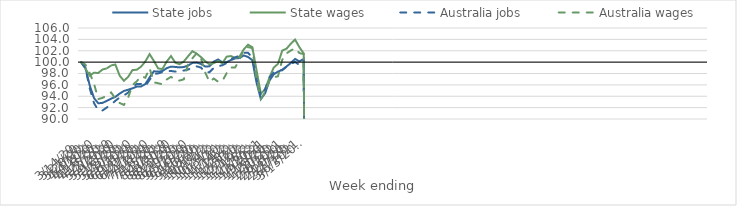
| Category | State jobs | State wages | Australia jobs | Australia wages |
|---|---|---|---|---|
| 14/03/2020 | 100 | 100 | 100 | 100 |
| 21/03/2020 | 99.025 | 98.86 | 98.956 | 99.571 |
| 28/03/2020 | 95.919 | 97.625 | 95.411 | 98.095 |
| 04/04/2020 | 93.692 | 98.134 | 92.814 | 96.217 |
| 11/04/2020 | 92.763 | 98.092 | 91.522 | 93.51 |
| 18/04/2020 | 92.832 | 98.711 | 91.499 | 93.706 |
| 25/04/2020 | 93.193 | 98.894 | 92.024 | 94.115 |
| 02/05/2020 | 93.578 | 99.418 | 92.518 | 94.669 |
| 09/05/2020 | 93.887 | 99.583 | 93.198 | 93.587 |
| 16/05/2020 | 94.47 | 97.623 | 93.789 | 92.821 |
| 23/05/2020 | 94.932 | 96.717 | 94.145 | 92.476 |
| 30/05/2020 | 95.151 | 97.42 | 94.654 | 93.783 |
| 06/06/2020 | 95.396 | 98.605 | 95.642 | 95.969 |
| 13/06/2020 | 95.694 | 98.662 | 96.146 | 96.63 |
| 20/06/2020 | 95.718 | 99.201 | 96.166 | 97.54 |
| 27/06/2020 | 96.144 | 100.112 | 95.757 | 97.254 |
| 04/07/2020 | 97.306 | 101.406 | 96.891 | 98.931 |
| 11/07/2020 | 98.39 | 100.205 | 97.918 | 96.452 |
| 18/07/2020 | 98.326 | 98.885 | 98.015 | 96.287 |
| 25/07/2020 | 98.437 | 98.79 | 98.234 | 96.104 |
| 01/08/2020 | 98.94 | 100.108 | 98.45 | 96.943 |
| 08/08/2020 | 99.208 | 101.063 | 98.442 | 97.412 |
| 15/08/2020 | 99.155 | 99.901 | 98.335 | 96.914 |
| 22/08/2020 | 99.075 | 99.636 | 98.39 | 96.757 |
| 29/08/2020 | 99.139 | 100.112 | 98.521 | 96.978 |
| 05/09/2020 | 99.399 | 101.038 | 98.687 | 99.677 |
| 12/09/2020 | 99.861 | 101.919 | 99.091 | 100.68 |
| 19/09/2020 | 99.918 | 101.497 | 99.254 | 101.536 |
| 26/09/2020 | 99.669 | 100.883 | 99.049 | 100.689 |
| 03/10/2020 | 99.23 | 100.154 | 98.196 | 98.175 |
| 10/10/2020 | 99.261 | 99.603 | 98.237 | 96.534 |
| 17/10/2020 | 100.087 | 99.826 | 98.99 | 97.113 |
| 24/10/2020 | 100.46 | 100.181 | 99.254 | 96.552 |
| 31/10/2020 | 99.97 | 99.81 | 99.461 | 96.668 |
| 07/11/2020 | 99.993 | 100.958 | 99.844 | 98.053 |
| 14/11/2020 | 100.359 | 101.07 | 100.553 | 99.053 |
| 21/11/2020 | 100.654 | 100.727 | 100.846 | 99.075 |
| 28/11/2020 | 100.712 | 100.957 | 101.126 | 100.407 |
| 05/12/2020 | 101.175 | 102.231 | 101.622 | 102.179 |
| 12/12/2020 | 100.906 | 103.065 | 101.647 | 102.628 |
| 19/12/2020 | 100.347 | 102.629 | 100.808 | 102.478 |
| 26/12/2020 | 96.378 | 98.538 | 96.977 | 96.957 |
| 02/01/2021 | 93.506 | 94.45 | 94.05 | 93.527 |
| 09/01/2021 | 94.525 | 95.182 | 95.274 | 94.722 |
| 16/01/2021 | 96.749 | 97.3 | 97.292 | 96.737 |
| 23/01/2021 | 97.854 | 99.028 | 98.18 | 97.336 |
| 30/01/2021 | 98.328 | 99.696 | 98.522 | 97.507 |
| 06/02/2021 | 98.654 | 102.032 | 98.581 | 100.419 |
| 13/02/2021 | 99.238 | 102.366 | 99.185 | 101.54 |
| 20/02/2021 | 99.845 | 103.233 | 99.643 | 102.046 |
| 27/02/2021 | 100.566 | 103.966 | 100.036 | 102.451 |
| 06/03/2021 | 100.125 | 102.636 | 99.503 | 101.603 |
| 13/03/2021 | 100.559 | 101.539 | 100.244 | 101.4 |